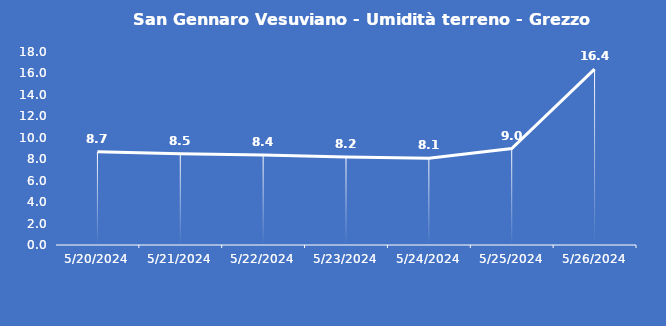
| Category | San Gennaro Vesuviano - Umidità terreno - Grezzo (%VWC) |
|---|---|
| 5/20/24 | 8.7 |
| 5/21/24 | 8.5 |
| 5/22/24 | 8.4 |
| 5/23/24 | 8.2 |
| 5/24/24 | 8.1 |
| 5/25/24 | 9 |
| 5/26/24 | 16.4 |